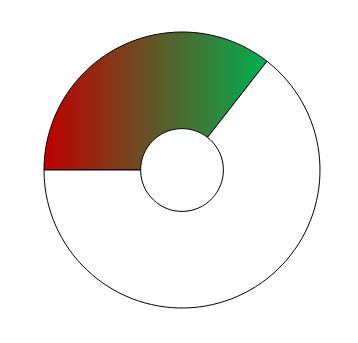
| Category | Series 0 |
|---|---|
| 0 | 128 |
| 1 | 232 |